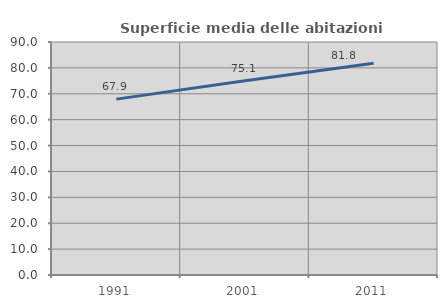
| Category | Superficie media delle abitazioni occupate |
|---|---|
| 1991.0 | 67.931 |
| 2001.0 | 75.063 |
| 2011.0 | 81.775 |